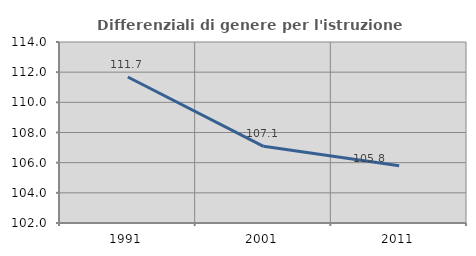
| Category | Differenziali di genere per l'istruzione superiore |
|---|---|
| 1991.0 | 111.679 |
| 2001.0 | 107.081 |
| 2011.0 | 105.795 |